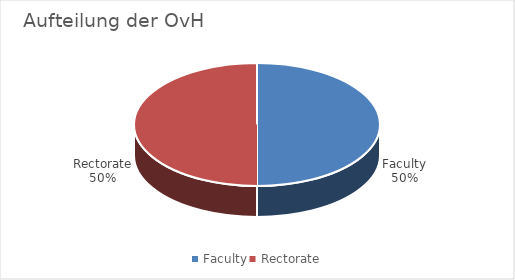
| Category | Prozent |
|---|---|
| Faculty | 0.5 |
| Rectorate | 0.5 |